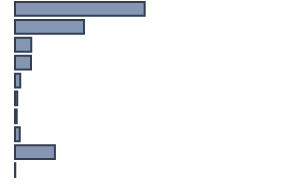
| Category | 5,7 |
|---|---|
| 0 | 45.5 |
| 1 | 24.2 |
| 2 | 5.7 |
| 3 | 5.6 |
| 4 | 1.8 |
| 5 | 0.8 |
| 6 | 0.6 |
| 7 | 1.7 |
| 8 | 14 |
| 9 | 0.1 |